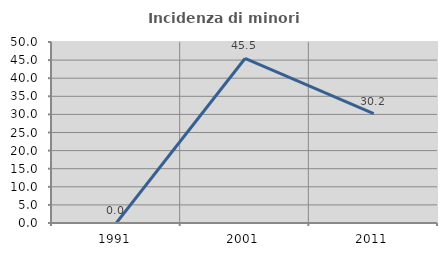
| Category | Incidenza di minori stranieri |
|---|---|
| 1991.0 | 0 |
| 2001.0 | 45.455 |
| 2011.0 | 30.233 |